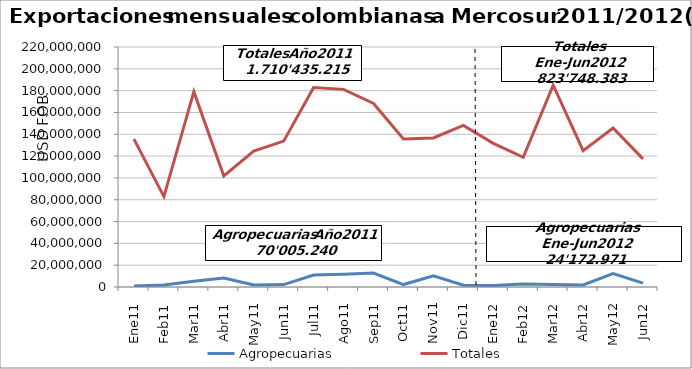
| Category | Agropecuarias | Totales |
|---|---|---|
| 0 | 931760.49 | 135602427.96 |
| 1 | 1936847.58 | 82895007.69 |
| 2 | 5339148.52 | 179028720.14 |
| 3 | 8261057.17 | 101854304.04 |
| 4 | 1792064.44 | 124539978.25 |
| 5 | 2204194.09 | 133725417.41 |
| 6 | 10908554.13 | 182902226.42 |
| 7 | 11624363.56 | 181156804.06 |
| 8 | 12754064.44 | 168291372.31 |
| 9 | 2244685.37 | 135771257.03 |
| 10 | 10300284.58 | 136589403.71 |
| 11 | 1708215.81 | 148078295.64 |
| 12 | 1386760.58 | 131633473.03 |
| 13 | 2772137.87 | 118881223.16 |
| 14 | 2344404.43 | 184999783.08 |
| 15 | 1846656.65 | 125021513.23 |
| 16 | 12289589.5 | 145755602.45 |
| 17 | 3533422.07 | 117456787.87 |